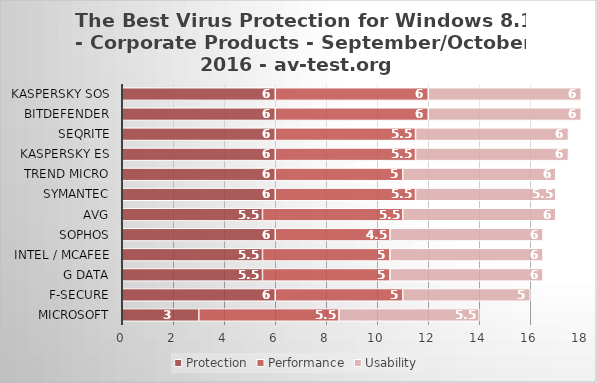
| Category | Protection | Performance | Usability |
|---|---|---|---|
| Microsoft | 3 | 5.5 | 5.5 |
| F-Secure | 6 | 5 | 5 |
| G Data | 5.5 | 5 | 6 |
| Intel / McAfee | 5.5 | 5 | 6 |
| Sophos | 6 | 4.5 | 6 |
| AVG | 5.5 | 5.5 | 6 |
| Symantec | 6 | 5.5 | 5.5 |
| Trend Micro | 6 | 5 | 6 |
| Kaspersky ES | 6 | 5.5 | 6 |
| Seqrite | 6 | 5.5 | 6 |
| Bitdefender | 6 | 6 | 6 |
| Kaspersky SOS | 6 | 6 | 6 |